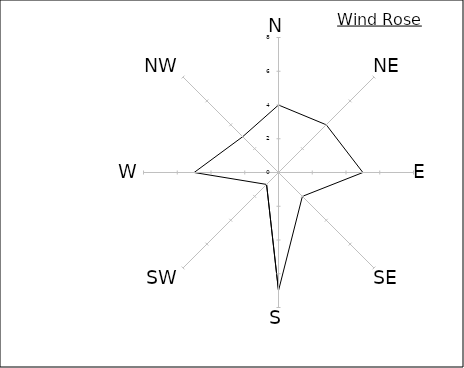
| Category | Series 0 |
|---|---|
| N | 4 |
| NE | 4 |
| E | 5 |
| SE | 2 |
| S | 7 |
| SW | 1 |
| W | 5 |
| NW | 3 |